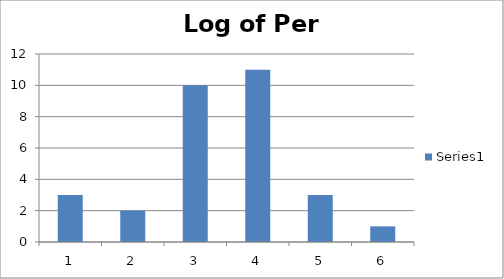
| Category | Series 0 |
|---|---|
| 0 | 3 |
| 1 | 2 |
| 2 | 10 |
| 3 | 11 |
| 4 | 3 |
| 5 | 1 |